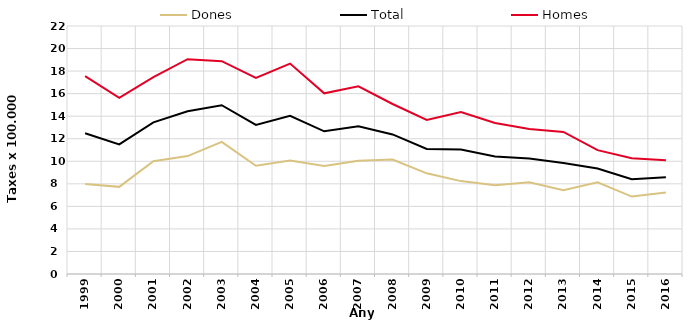
| Category | Dones | Total | Homes |
|---|---|---|---|
| 1999.0 | 7.99 | 12.49 | 17.55 |
| 2000.0 | 7.73 | 11.5 | 15.62 |
| 2001.0 | 10 | 13.45 | 17.47 |
| 2002.0 | 10.46 | 14.44 | 19.06 |
| 2003.0 | 11.72 | 14.97 | 18.88 |
| 2004.0 | 9.6 | 13.23 | 17.4 |
| 2005.0 | 10.06 | 14.04 | 18.67 |
| 2006.0 | 9.59 | 12.66 | 16.03 |
| 2007.0 | 10.05 | 13.1 | 16.65 |
| 2008.0 | 10.15 | 12.38 | 15.08 |
| 2009.0 | 8.93 | 11.09 | 13.67 |
| 2010.0 | 8.24 | 11.04 | 14.37 |
| 2011.0 | 7.87 | 10.42 | 13.4 |
| 2012.0 | 8.13 | 10.24 | 12.86 |
| 2013.0 | 7.43 | 9.85 | 12.6 |
| 2014.0 | 8.13 | 9.36 | 10.99 |
| 2015.0 | 6.87 | 8.4 | 10.26 |
| 2016.0 | 7.23 | 8.58 | 10.09 |